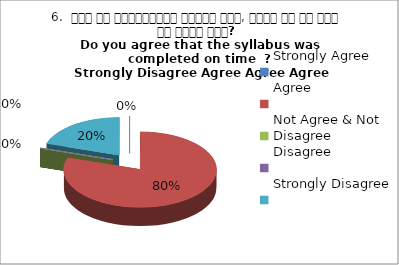
| Category | 6.  समय पर पाठ्यक्रम पूर्ण हुआ, क्या आप इस बात से सहमत हैं? 
Do you agree that the syllabus was completed on time  ?
 Strongly Disagree Agree Agree Agree Agree |
|---|---|
| Strongly Agree | 0 |
| Agree | 4 |
| Not Agree & Not Disagree | 0 |
| Disagree | 0 |
| Strongly Disagree | 1 |